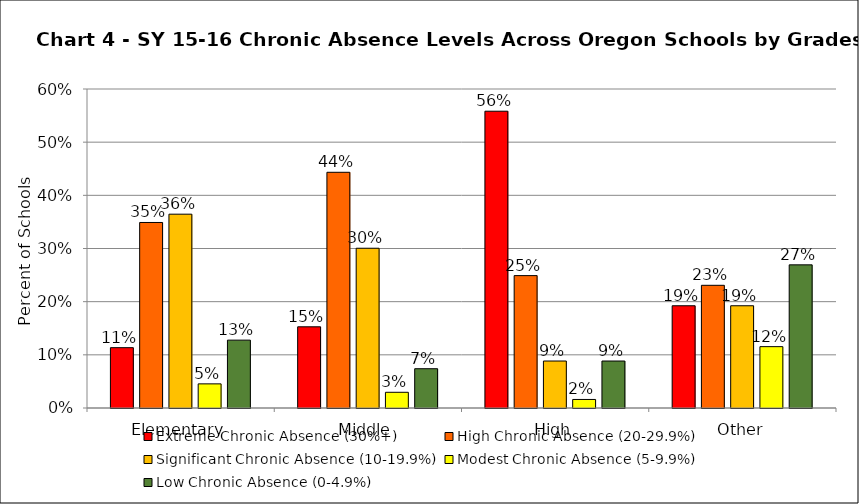
| Category | Extreme Chronic Absence (30%+) | High Chronic Absence (20-29.9%) | Significant Chronic Absence (10-19.9%) | Modest Chronic Absence (5-9.9%) | Low Chronic Absence (0-4.9%) |
|---|---|---|---|---|---|
| 0 | 0.113 | 0.349 | 0.365 | 0.045 | 0.128 |
| 1 | 0.153 | 0.443 | 0.3 | 0.03 | 0.074 |
| 2 | 0.558 | 0.249 | 0.088 | 0.016 | 0.088 |
| 3 | 0.192 | 0.231 | 0.192 | 0.115 | 0.269 |